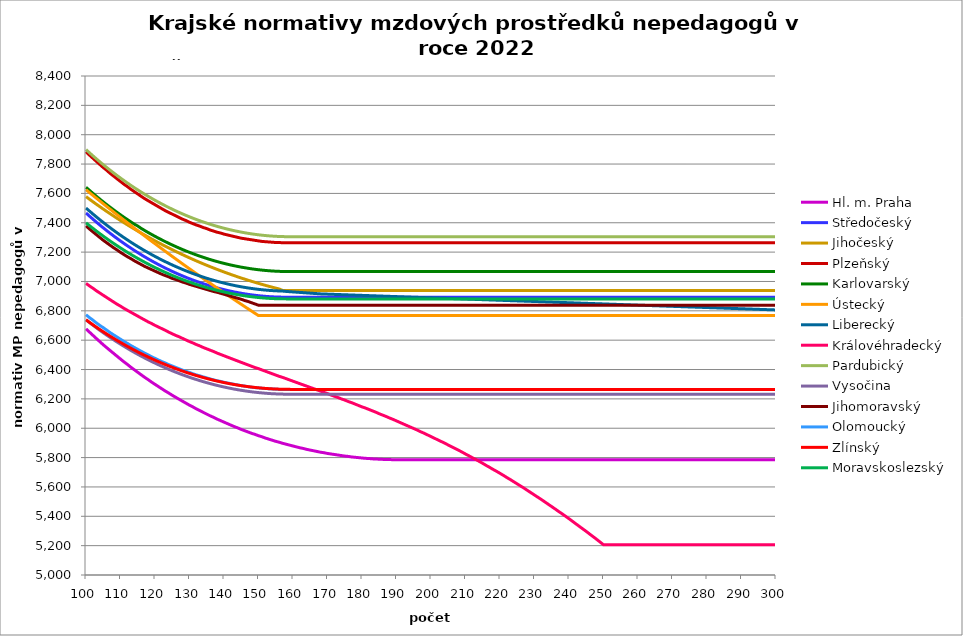
| Category | Hl. m. Praha | Středočeský | Jihočeský | Plzeňský | Karlovarský  | Ústecký   | Liberecký | Královéhradecký | Pardubický | Vysočina | Jihomoravský | Olomoucký | Zlínský | Moravskoslezský |
|---|---|---|---|---|---|---|---|---|---|---|---|---|---|---|
| 100.0 | 6676.923 | 7466.548 | 7577.911 | 7884.544 | 7641.729 | 7625.239 | 7500.268 | 6987.106 | 7898.649 | 6738.166 | 7379 | 6773.107 | 6738.973 | 7399.633 |
| 101.0 | 6655.006 | 7445.368 | 7560.495 | 7860.931 | 7620.936 | 7605.957 | 7479.754 | 6969.691 | 7877.157 | 6719.787 | 7357.595 | 6753.969 | 6721.897 | 7380.663 |
| 102.0 | 6633.232 | 7424.673 | 7543.346 | 7839.587 | 7600.608 | 7586.771 | 7459.699 | 6954.091 | 7856.145 | 6701.976 | 7338.243 | 6736.664 | 6705.197 | 7362.117 |
| 103.0 | 6611.6 | 7404.456 | 7526.462 | 7818.359 | 7580.738 | 7567.682 | 7440.097 | 6936.839 | 7835.607 | 6684.414 | 7318.993 | 6717.731 | 6688.867 | 7343.989 |
| 104.0 | 6590.109 | 7384.71 | 7509.839 | 7797.245 | 7561.32 | 7548.689 | 7420.941 | 6921.386 | 7815.537 | 6667.253 | 7299.843 | 6700.612 | 6672.904 | 7326.274 |
| 105.0 | 6568.757 | 7365.428 | 7493.475 | 7776.246 | 7542.349 | 7529.791 | 7402.226 | 6906.001 | 7795.928 | 6650.639 | 7280.793 | 6685.278 | 6657.301 | 7308.966 |
| 106.0 | 6549.054 | 7346.605 | 7477.365 | 7757.442 | 7523.818 | 7510.988 | 7383.946 | 6890.685 | 7776.774 | 6634.261 | 7263.733 | 6668.324 | 6642.056 | 7292.06 |
| 107.0 | 6529.469 | 7328.233 | 7461.509 | 7736.656 | 7505.721 | 7492.278 | 7366.095 | 6875.436 | 7758.068 | 6618.267 | 7246.753 | 6651.455 | 6627.163 | 7275.551 |
| 108.0 | 6510 | 7310.307 | 7445.902 | 7718.043 | 7488.053 | 7473.661 | 7348.667 | 6860.255 | 7739.806 | 6602.652 | 7229.852 | 6636.345 | 6612.618 | 7259.435 |
| 109.0 | 6490.647 | 7292.821 | 7430.543 | 7699.52 | 7470.808 | 7455.136 | 7331.657 | 6845.141 | 7721.981 | 6587.413 | 7214.895 | 6621.304 | 6598.417 | 7243.706 |
| 110.0 | 6471.409 | 7275.769 | 7415.428 | 7681.085 | 7453.981 | 7436.703 | 7315.06 | 6831.762 | 7704.589 | 6572.692 | 7198.142 | 6606.332 | 6584.556 | 7228.36 |
| 111.0 | 6452.285 | 7259.146 | 7400.555 | 7662.739 | 7437.567 | 7418.361 | 7298.87 | 6816.772 | 7687.623 | 6558.187 | 7183.316 | 6591.426 | 6571.031 | 7213.392 |
| 112.0 | 6434.731 | 7242.946 | 7385.921 | 7646.504 | 7421.561 | 7400.109 | 7283.083 | 6803.504 | 7671.079 | 6544.043 | 7168.551 | 6578.234 | 6557.838 | 7198.799 |
| 113.0 | 6415.823 | 7227.165 | 7371.524 | 7628.322 | 7405.958 | 7381.947 | 7267.694 | 6790.287 | 7654.951 | 6530.255 | 7155.681 | 6563.455 | 6544.974 | 7184.576 |
| 114.0 | 6398.467 | 7211.796 | 7357.362 | 7612.233 | 7390.754 | 7363.874 | 7252.699 | 6777.121 | 7639.236 | 6516.968 | 7141.029 | 6550.374 | 6532.436 | 7170.719 |
| 115.0 | 6381.205 | 7196.837 | 7343.432 | 7596.212 | 7377.787 | 7345.889 | 7238.092 | 6764.006 | 7623.927 | 6503.734 | 7128.258 | 6537.345 | 6520.218 | 7157.224 |
| 116.0 | 6364.036 | 7182.28 | 7329.731 | 7580.257 | 7361.523 | 7327.991 | 7223.87 | 6750.942 | 7609.022 | 6491.139 | 7115.532 | 6524.367 | 6508.319 | 7144.088 |
| 117.0 | 6346.959 | 7168.123 | 7316.258 | 7564.37 | 7347.487 | 7310.181 | 7210.028 | 6737.928 | 7594.515 | 6478.738 | 7102.851 | 6511.441 | 6496.735 | 7131.306 |
| 118.0 | 6331.385 | 7154.361 | 7303.011 | 7550.523 | 7333.834 | 7292.457 | 7196.563 | 6724.964 | 7580.402 | 6466.674 | 7092.018 | 6500.173 | 6485.463 | 7118.875 |
| 119.0 | 6314.483 | 7140.99 | 7289.986 | 7536.727 | 7320.557 | 7274.819 | 7183.47 | 6713.661 | 7566.679 | 6454.944 | 7081.218 | 6487.343 | 6474.5 | 7106.792 |
| 120.0 | 6299.068 | 7128.005 | 7277.182 | 7522.981 | 7307.654 | 7257.265 | 7170.746 | 6700.791 | 7553.342 | 6443.689 | 7070.451 | 6476.158 | 6463.843 | 7095.054 |
| 121.0 | 6283.728 | 7115.402 | 7264.597 | 7509.285 | 7295.121 | 7239.797 | 7158.386 | 6689.569 | 7540.388 | 6432.617 | 7059.717 | 6465.011 | 6453.489 | 7083.656 |
| 122.0 | 6268.463 | 7103.179 | 7252.229 | 7495.639 | 7282.955 | 7222.412 | 7146.389 | 6678.385 | 7527.812 | 6421.869 | 7049.015 | 6453.903 | 6443.436 | 7072.597 |
| 123.0 | 6253.272 | 7091.33 | 7240.076 | 7482.042 | 7271.151 | 7205.11 | 7134.749 | 6667.239 | 7515.612 | 6411.442 | 7040.121 | 6444.412 | 6433.68 | 7061.873 |
| 124.0 | 6239.525 | 7079.853 | 7228.136 | 7470.427 | 7259.707 | 7187.892 | 7123.464 | 6654.545 | 7503.783 | 6401.332 | 7031.25 | 6433.374 | 6424.219 | 7051.481 |
| 125.0 | 6224.474 | 7068.744 | 7216.406 | 7458.848 | 7248.619 | 7170.755 | 7112.53 | 6643.478 | 7492.322 | 6391.539 | 7020.634 | 6423.943 | 6415.051 | 7041.418 |
| 126.0 | 6210.853 | 7058.001 | 7204.886 | 7447.305 | 7237.884 | 7153.7 | 7101.945 | 6632.448 | 7481.227 | 6382.199 | 7013.575 | 6414.54 | 6406.173 | 7031.682 |
| 127.0 | 6197.293 | 7047.618 | 7193.573 | 7435.797 | 7227.5 | 7136.726 | 7091.706 | 6623.022 | 7470.493 | 6372.886 | 7004.77 | 6405.164 | 6397.584 | 7022.271 |
| 128.0 | 6183.791 | 7037.595 | 7182.466 | 7424.325 | 7217.463 | 7119.832 | 7081.809 | 6612.06 | 7460.119 | 6364.022 | 6995.988 | 6395.816 | 6389.28 | 7013.181 |
| 129.0 | 6170.348 | 7027.927 | 7171.562 | 7414.792 | 7207.77 | 7103.018 | 7072.252 | 6601.133 | 7450.1 | 6355.603 | 6988.978 | 6388.047 | 6381.26 | 7004.41 |
| 130.0 | 6156.963 | 7018.612 | 7160.861 | 7403.385 | 7198.42 | 7086.283 | 7063.033 | 6590.243 | 7440.435 | 6347.345 | 6980.235 | 6380.296 | 6373.521 | 6995.956 |
| 131.0 | 6144.966 | 7009.647 | 7150.36 | 7393.905 | 7189.409 | 7069.627 | 7054.148 | 6580.937 | 7431.121 | 6339.389 | 6973.257 | 6371.02 | 6366.062 | 6987.817 |
| 132.0 | 6131.692 | 7001.03 | 7140.057 | 7384.45 | 7180.735 | 7053.048 | 7045.595 | 6570.113 | 7422.156 | 6331.73 | 6966.292 | 6363.311 | 6358.881 | 6979.991 |
| 133.0 | 6119.793 | 6992.758 | 7129.952 | 7376.903 | 7172.395 | 7036.548 | 7037.372 | 6560.863 | 7413.536 | 6324.228 | 6959.341 | 6357.157 | 6351.976 | 6972.475 |
| 134.0 | 6107.941 | 6984.829 | 7120.043 | 7367.492 | 7164.388 | 7020.124 | 7029.478 | 6550.105 | 7405.259 | 6317.16 | 6952.405 | 6349.481 | 6345.345 | 6965.268 |
| 135.0 | 6096.134 | 6977.241 | 7110.328 | 7359.98 | 7156.711 | 7003.777 | 7021.908 | 6540.912 | 7397.324 | 6310.521 | 6945.482 | 6343.353 | 6338.986 | 6958.367 |
| 136.0 | 6084.373 | 6969.99 | 7100.805 | 7350.611 | 7149.362 | 6987.506 | 7014.663 | 6531.745 | 7389.728 | 6304.035 | 6938.572 | 6335.711 | 6332.898 | 6951.771 |
| 137.0 | 6073.957 | 6963.076 | 7091.474 | 7343.133 | 7142.339 | 6971.311 | 7007.739 | 6522.603 | 7382.469 | 6297.837 | 6931.677 | 6329.61 | 6327.08 | 6945.479 |
| 138.0 | 6062.281 | 6956.497 | 7082.332 | 7335.671 | 7135.64 | 6955.19 | 7001.134 | 6511.97 | 7375.545 | 6291.926 | 6926.514 | 6323.521 | 6321.53 | 6939.489 |
| 139.0 | 6051.94 | 6950.25 | 7073.379 | 7330.084 | 7129.264 | 6939.144 | 6994.848 | 6502.884 | 7368.954 | 6286.3 | 6919.643 | 6318.962 | 6316.246 | 6933.798 |
| 140.0 | 6041.635 | 6944.333 | 7064.614 | 7322.648 | 7123.208 | 6923.171 | 6988.878 | 6493.823 | 7362.695 | 6281.095 | 6912.785 | 6312.893 | 6311.227 | 6928.406 |
| 141.0 | 6031.364 | 6938.746 | 7056.034 | 7317.081 | 7117.472 | 6907.272 | 6983.222 | 6484.787 | 7356.766 | 6275.898 | 6905.941 | 6308.349 | 6306.473 | 6923.312 |
| 142.0 | 6021.129 | 6933.486 | 7047.638 | 7311.522 | 7112.053 | 6891.446 | 6977.88 | 6475.776 | 7351.165 | 6271.119 | 6899.11 | 6303.812 | 6301.981 | 6918.514 |
| 143.0 | 6010.928 | 6928.552 | 7039.426 | 7305.972 | 7106.951 | 6875.692 | 6972.85 | 6466.79 | 7345.891 | 6266.62 | 6892.292 | 6299.281 | 6297.751 | 6914.01 |
| 144.0 | 6002.03 | 6923.943 | 7031.396 | 7300.43 | 7102.163 | 6860.01 | 6968.13 | 6457.829 | 7340.943 | 6262.4 | 6885.489 | 6294.757 | 6293.782 | 6909.8 |
| 145.0 | 5991.894 | 6919.657 | 7023.547 | 7294.896 | 7097.689 | 6844.399 | 6963.719 | 6448.893 | 7336.318 | 6258.457 | 6878.698 | 6290.239 | 6290.072 | 6905.883 |
| 146.0 | 5983.052 | 6915.694 | 7015.877 | 7291.212 | 7093.528 | 6828.86 | 6959.616 | 6439.982 | 7332.017 | 6254.79 | 6870.229 | 6287.231 | 6286.621 | 6902.257 |
| 147.0 | 5974.237 | 6912.051 | 7008.387 | 7287.532 | 7089.678 | 6813.39 | 6955.821 | 6431.095 | 7328.037 | 6251.399 | 6863.469 | 6282.724 | 6283.428 | 6898.922 |
| 148.0 | 5965.448 | 6908.729 | 7001.073 | 7283.855 | 7086.138 | 6797.991 | 6952.331 | 6422.232 | 7324.379 | 6248.147 | 6855.037 | 6279.723 | 6280.493 | 6895.877 |
| 149.0 | 5957.935 | 6905.726 | 6993.937 | 7280.182 | 7082.907 | 6782.661 | 6949.146 | 6413.394 | 7321.039 | 6245.439 | 6846.626 | 6276.725 | 6277.813 | 6893.121 |
| 150.0 | 5949.193 | 6903.041 | 6986.976 | 7276.512 | 7079.986 | 6767.4 | 6946.266 | 6406.048 | 7318.019 | 6242.869 | 6838.235 | 6275.227 | 6275.39 | 6890.654 |
| 151.0 | 5941.721 | 6900.674 | 6980.189 | 7272.846 | 7077.372 | 6767.4 | 6943.689 | 6397.255 | 7315.318 | 6240.707 | 6838.235 | 6272.233 | 6273.222 | 6888.474 |
| 152.0 | 5933.027 | 6898.623 | 6973.575 | 7271.015 | 7075.065 | 6767.4 | 6941.414 | 6388.485 | 7312.933 | 6238.546 | 6838.235 | 6270.737 | 6271.308 | 6886.581 |
| 153.0 | 5925.595 | 6896.889 | 6967.135 | 7269.184 | 7073.064 | 6767.4 | 6939.442 | 6379.74 | 7310.865 | 6236.656 | 6838.235 | 6269.242 | 6269.649 | 6884.976 |
| 154.0 | 5918.182 | 6895.471 | 6960.866 | 7267.355 | 7071.37 | 6767.4 | 6937.772 | 6371.018 | 7309.114 | 6235.172 | 6838.235 | 6267.747 | 6268.243 | 6883.656 |
| 155.0 | 5910.787 | 6894.369 | 6954.767 | 7265.526 | 7069.981 | 6767.4 | 6936.403 | 6362.321 | 7307.679 | 6234.093 | 6838.235 | 6266.254 | 6267.091 | 6882.623 |
| 156.0 | 5904.639 | 6893.582 | 6948.839 | 7265.526 | 7068.898 | 6767.4 | 6935.335 | 6353.647 | 7306.559 | 6233.15 | 6838.235 | 6264.761 | 6266.192 | 6881.876 |
| 157.0 | 5897.278 | 6893.109 | 6938.592 | 7263.698 | 7068.119 | 6767.4 | 6934.567 | 6346.437 | 7305.754 | 6232.476 | 6838.235 | 6264.761 | 6265.546 | 6881.414 |
| 158.0 | 5891.158 | 6892.952 | 6938.592 | 7263.698 | 7067.645 | 6767.4 | 6932.066 | 6337.806 | 7305.264 | 6231.937 | 6838.235 | 6263.268 | 6265.153 | 6881.406 |
| 159.0 | 5885.051 | 6893.109 | 6938.592 | 7263.698 | 7067.476 | 6767.4 | 6930.399 | 6329.199 | 7305.089 | 6231.802 | 6838.235 | 6263.268 | 6265.013 | 6881.406 |
| 160.0 | 5878.956 | 6892.952 | 6938.592 | 7263.698 | 7067.612 | 6767.4 | 6928.733 | 6320.615 | 7304.88 | 6231.667 | 6838.235 | 6263.268 | 6263.441 | 6881.406 |
| 161.0 | 5872.874 | 6892.952 | 6938.592 | 7263.698 | 7067.273 | 6767.4 | 6927.068 | 6312.054 | 7304.88 | 6231.667 | 6838.235 | 6263.268 | 6263.441 | 6881.406 |
| 162.0 | 5866.804 | 6892.952 | 6938.592 | 7263.698 | 7067.273 | 6767.4 | 6925.404 | 6303.517 | 7304.88 | 6231.667 | 6838.235 | 6263.268 | 6263.441 | 6881.406 |
| 163.0 | 5861.958 | 6892.952 | 6938.592 | 7263.698 | 7067.273 | 6767.4 | 6923.74 | 6295.002 | 7304.88 | 6231.667 | 6838.235 | 6263.268 | 6263.441 | 6881.406 |
| 164.0 | 5855.911 | 6892.952 | 6938.592 | 7263.698 | 7067.273 | 6767.4 | 6922.077 | 6286.511 | 7304.88 | 6231.667 | 6838.235 | 6263.268 | 6263.441 | 6881.406 |
| 165.0 | 5851.082 | 6892.952 | 6938.592 | 7263.698 | 7067.273 | 6767.4 | 6920.415 | 6278.042 | 7304.88 | 6231.667 | 6838.235 | 6263.268 | 6263.441 | 6881.406 |
| 166.0 | 5846.262 | 6892.952 | 6938.592 | 7263.698 | 7067.273 | 6767.4 | 6918.754 | 6269.596 | 7304.88 | 6231.667 | 6838.235 | 6263.268 | 6263.441 | 6881.406 |
| 167.0 | 5841.449 | 6892.952 | 6938.592 | 7263.698 | 7067.273 | 6767.4 | 6917.094 | 6261.173 | 7304.88 | 6231.667 | 6838.235 | 6263.268 | 6263.441 | 6881.406 |
| 168.0 | 5836.644 | 6892.952 | 6938.592 | 7263.698 | 7067.273 | 6767.4 | 6915.434 | 6252.773 | 7304.88 | 6231.667 | 6838.235 | 6263.268 | 6263.441 | 6881.406 |
| 169.0 | 5833.046 | 6892.952 | 6938.592 | 7263.698 | 7067.273 | 6767.4 | 6914.458 | 6244.395 | 7304.88 | 6231.667 | 6838.235 | 6263.268 | 6263.441 | 6881.406 |
| 170.0 | 5828.255 | 6892.952 | 6938.592 | 7263.698 | 7067.273 | 6767.4 | 6913.775 | 6236.039 | 7304.88 | 6231.667 | 6838.235 | 6263.268 | 6263.441 | 6881.406 |
| 171.0 | 5824.667 | 6892.952 | 6938.592 | 7263.698 | 7067.273 | 6767.4 | 6912.875 | 6226.319 | 7304.88 | 6231.667 | 6838.235 | 6263.268 | 6263.441 | 6881.406 |
| 172.0 | 5821.083 | 6892.952 | 6938.592 | 7263.698 | 7067.273 | 6767.4 | 6912.033 | 6218.012 | 7304.88 | 6231.667 | 6838.235 | 6263.268 | 6263.441 | 6881.406 |
| 173.0 | 5817.504 | 6892.952 | 6938.592 | 7263.698 | 7067.273 | 6767.4 | 6911.192 | 6209.727 | 7304.88 | 6231.667 | 6838.235 | 6263.268 | 6263.441 | 6881.406 |
| 174.0 | 5813.929 | 6892.952 | 6938.592 | 7263.698 | 7067.273 | 6767.4 | 6910.351 | 6200.089 | 7304.88 | 6231.667 | 6838.235 | 6263.268 | 6263.441 | 6881.406 |
| 175.0 | 5810.358 | 6892.952 | 6938.592 | 7263.698 | 7067.273 | 6767.4 | 6909.51 | 6191.851 | 7304.88 | 6231.667 | 6838.235 | 6263.268 | 6263.441 | 6881.406 |
| 176.0 | 5807.98 | 6892.952 | 6938.592 | 7263.698 | 7067.273 | 6767.4 | 6908.669 | 6182.268 | 7304.88 | 6231.667 | 6838.235 | 6263.268 | 6263.441 | 6881.406 |
| 177.0 | 5804.417 | 6892.952 | 6938.592 | 7263.698 | 7067.273 | 6767.4 | 6907.829 | 6174.078 | 7304.88 | 6231.667 | 6838.235 | 6263.268 | 6263.441 | 6881.406 |
| 178.0 | 5802.044 | 6892.952 | 6938.592 | 7263.698 | 7067.273 | 6767.4 | 6906.989 | 6164.55 | 7304.88 | 6231.667 | 6838.235 | 6263.268 | 6263.441 | 6881.406 |
| 179.0 | 5799.673 | 6892.952 | 6938.592 | 7263.698 | 7067.273 | 6767.4 | 6906.148 | 6155.052 | 7304.88 | 6231.667 | 6838.235 | 6263.268 | 6263.441 | 6881.406 |
| 180.0 | 5797.304 | 6892.952 | 6938.592 | 7263.698 | 7067.273 | 6767.4 | 6905.309 | 6145.582 | 7304.88 | 6231.667 | 6838.235 | 6263.268 | 6263.441 | 6881.406 |
| 181.0 | 5794.937 | 6892.952 | 6938.592 | 7263.698 | 7067.273 | 6767.4 | 6904.469 | 6137.489 | 7304.88 | 6231.667 | 6838.235 | 6263.268 | 6263.441 | 6881.406 |
| 182.0 | 5793.754 | 6892.952 | 6938.592 | 7263.698 | 7067.273 | 6767.4 | 6903.63 | 6128.074 | 7304.88 | 6231.667 | 6838.235 | 6263.268 | 6263.441 | 6881.406 |
| 183.0 | 5791.39 | 6892.952 | 6938.592 | 7263.698 | 7067.273 | 6767.4 | 6902.79 | 6118.687 | 7304.88 | 6231.667 | 6838.235 | 6263.268 | 6263.441 | 6881.406 |
| 184.0 | 5790.208 | 6892.952 | 6938.592 | 7263.698 | 7067.273 | 6767.4 | 6901.951 | 6109.329 | 7304.88 | 6231.667 | 6838.235 | 6263.268 | 6263.441 | 6881.406 |
| 185.0 | 5789.027 | 6892.952 | 6938.592 | 7263.698 | 7067.273 | 6767.4 | 6901.112 | 6098.67 | 7304.88 | 6231.667 | 6838.235 | 6263.268 | 6263.441 | 6881.406 |
| 186.0 | 5787.847 | 6892.952 | 6938.592 | 7263.698 | 7067.273 | 6767.4 | 6900.274 | 6089.373 | 7304.88 | 6231.667 | 6838.235 | 6263.268 | 6263.441 | 6881.406 |
| 187.0 | 5786.667 | 6892.952 | 6938.592 | 7263.698 | 7067.273 | 6767.4 | 6899.435 | 6080.104 | 7304.88 | 6231.667 | 6838.235 | 6263.268 | 6263.441 | 6881.406 |
| 188.0 | 5786.667 | 6892.952 | 6938.592 | 7263.698 | 7067.273 | 6767.4 | 6898.597 | 6069.546 | 7304.88 | 6231.667 | 6838.235 | 6263.268 | 6263.441 | 6881.406 |
| 189.0 | 5785.487 | 6892.952 | 6938.592 | 7263.698 | 7067.273 | 6767.4 | 6897.759 | 6060.338 | 7304.88 | 6231.667 | 6838.235 | 6263.268 | 6263.441 | 6881.406 |
| 190.0 | 5785.487 | 6892.952 | 6938.592 | 7263.698 | 7067.273 | 6767.4 | 6896.921 | 6049.849 | 7304.88 | 6231.667 | 6838.235 | 6263.268 | 6263.441 | 6881.406 |
| 191.0 | 5785.487 | 6892.952 | 6938.592 | 7263.698 | 7067.273 | 6767.4 | 6896.084 | 6039.395 | 7304.88 | 6231.667 | 6838.235 | 6263.268 | 6263.441 | 6881.406 |
| 192.0 | 5785.487 | 6892.952 | 6938.592 | 7263.698 | 7067.273 | 6767.4 | 6895.246 | 6028.978 | 7304.88 | 6231.667 | 6838.235 | 6263.268 | 6263.441 | 6881.406 |
| 193.0 | 5785.487 | 6892.952 | 6938.592 | 7263.698 | 7067.273 | 6767.4 | 6894.409 | 6018.597 | 7304.88 | 6231.667 | 6838.235 | 6263.268 | 6263.441 | 6881.406 |
| 194.0 | 5785.487 | 6892.952 | 6938.592 | 7263.698 | 7067.273 | 6767.4 | 6893.572 | 6008.251 | 7304.88 | 6231.667 | 6838.235 | 6263.268 | 6263.441 | 6881.406 |
| 195.0 | 5785.487 | 6892.952 | 6938.592 | 7263.698 | 7067.273 | 6767.4 | 6892.735 | 5997.941 | 7304.88 | 6231.667 | 6838.235 | 6263.268 | 6263.441 | 6881.406 |
| 196.0 | 5785.487 | 6892.952 | 6938.592 | 7263.698 | 7067.273 | 6767.4 | 6891.899 | 5987.666 | 7304.88 | 6231.667 | 6838.235 | 6263.268 | 6263.441 | 6881.406 |
| 197.0 | 5785.487 | 6892.952 | 6938.592 | 7263.698 | 7067.273 | 6767.4 | 6891.062 | 5976.149 | 7304.88 | 6231.667 | 6838.235 | 6263.268 | 6263.441 | 6881.406 |
| 198.0 | 5785.487 | 6892.952 | 6938.592 | 7263.698 | 7067.273 | 6767.4 | 6890.226 | 5965.948 | 7304.88 | 6231.667 | 6838.235 | 6263.268 | 6263.441 | 6881.406 |
| 199.0 | 5785.487 | 6892.952 | 6938.592 | 7263.698 | 7067.273 | 6767.4 | 6889.39 | 5954.514 | 7304.88 | 6231.667 | 6838.235 | 6263.268 | 6263.441 | 6881.406 |
| 200.0 | 5785.487 | 6892.952 | 6938.592 | 7263.698 | 7067.273 | 6767.4 | 6888.554 | 5943.124 | 7304.88 | 6231.667 | 6838.235 | 6263.268 | 6263.441 | 6881.406 |
| 201.0 | 5785.487 | 6892.952 | 6938.592 | 7263.698 | 7067.273 | 6767.4 | 6887.719 | 5931.778 | 7304.88 | 6231.667 | 6838.235 | 6263.268 | 6263.441 | 6881.406 |
| 202.0 | 5785.487 | 6892.952 | 6938.592 | 7263.698 | 7067.273 | 6767.4 | 6886.883 | 5920.474 | 7304.88 | 6231.667 | 6838.235 | 6263.268 | 6263.441 | 6881.406 |
| 203.0 | 5785.487 | 6892.952 | 6938.592 | 7263.698 | 7067.273 | 6767.4 | 6886.048 | 5909.214 | 7304.88 | 6231.667 | 6838.235 | 6263.268 | 6263.441 | 6881.406 |
| 204.0 | 5785.487 | 6892.952 | 6938.592 | 7263.698 | 7067.273 | 6767.4 | 6885.213 | 5897.996 | 7304.88 | 6231.667 | 6838.235 | 6263.268 | 6263.441 | 6881.406 |
| 205.0 | 5785.487 | 6892.952 | 6938.592 | 7263.698 | 7067.273 | 6767.4 | 6884.378 | 5885.582 | 7304.88 | 6231.667 | 6838.235 | 6263.268 | 6263.441 | 6881.406 |
| 206.0 | 5785.487 | 6892.952 | 6938.592 | 7263.698 | 7067.273 | 6767.4 | 6883.544 | 5873.22 | 7304.88 | 6231.667 | 6838.235 | 6263.268 | 6263.441 | 6881.406 |
| 207.0 | 5785.487 | 6892.952 | 6938.592 | 7263.698 | 7067.273 | 6767.4 | 6882.709 | 5862.138 | 7304.88 | 6231.667 | 6838.235 | 6263.268 | 6263.441 | 6881.406 |
| 208.0 | 5785.487 | 6892.952 | 6938.592 | 7263.698 | 7067.273 | 6767.4 | 6881.875 | 5849.874 | 7304.88 | 6231.667 | 6838.235 | 6263.268 | 6263.441 | 6881.406 |
| 209.0 | 5785.487 | 6892.952 | 6938.592 | 7263.698 | 7067.273 | 6767.4 | 6881.041 | 5837.662 | 7304.88 | 6231.667 | 6838.235 | 6263.268 | 6263.441 | 6881.406 |
| 210.0 | 5785.487 | 6892.952 | 6938.592 | 7263.698 | 7067.273 | 6767.4 | 6880.208 | 5824.287 | 7304.88 | 6231.667 | 6838.235 | 6263.268 | 6263.441 | 6881.406 |
| 211.0 | 5785.487 | 6892.952 | 6938.592 | 7263.698 | 7067.273 | 6767.4 | 6879.374 | 5812.18 | 7304.88 | 6231.667 | 6838.235 | 6263.268 | 6263.441 | 6881.406 |
| 212.0 | 5785.487 | 6892.952 | 6938.592 | 7263.698 | 7067.273 | 6767.4 | 6878.541 | 5798.922 | 7304.88 | 6231.667 | 6838.235 | 6263.268 | 6263.441 | 6881.406 |
| 213.0 | 5785.487 | 6892.952 | 6938.592 | 7263.698 | 7067.273 | 6767.4 | 6877.707 | 5786.921 | 7304.88 | 6231.667 | 6838.235 | 6263.268 | 6263.441 | 6881.406 |
| 214.0 | 5785.487 | 6892.952 | 6938.592 | 7263.698 | 7067.273 | 6767.4 | 6876.875 | 5773.777 | 7304.88 | 6231.667 | 6838.235 | 6263.268 | 6263.441 | 6881.406 |
| 215.0 | 5785.487 | 6892.952 | 6938.592 | 7263.698 | 7067.273 | 6767.4 | 6876.042 | 5760.692 | 7304.88 | 6231.667 | 6838.235 | 6263.268 | 6263.441 | 6881.406 |
| 216.0 | 5785.487 | 6892.952 | 6938.592 | 7263.698 | 7067.273 | 6767.4 | 6875.209 | 5746.486 | 7304.88 | 6231.667 | 6838.235 | 6263.268 | 6263.441 | 6881.406 |
| 217.0 | 5785.487 | 6892.952 | 6938.592 | 7263.698 | 7067.273 | 6767.4 | 6874.377 | 5733.525 | 7304.88 | 6231.667 | 6838.235 | 6263.268 | 6263.441 | 6881.406 |
| 218.0 | 5785.487 | 6892.952 | 6938.592 | 7263.698 | 7067.273 | 6767.4 | 6873.545 | 5719.452 | 7304.88 | 6231.667 | 6838.235 | 6263.268 | 6263.441 | 6881.406 |
| 219.0 | 5785.487 | 6892.952 | 6938.592 | 7263.698 | 7067.273 | 6767.4 | 6872.713 | 5706.612 | 7304.88 | 6231.667 | 6838.235 | 6263.268 | 6263.441 | 6881.406 |
| 220.0 | 5785.487 | 6892.952 | 6938.592 | 7263.698 | 7067.273 | 6767.4 | 6871.881 | 5692.671 | 7304.88 | 6231.667 | 6838.235 | 6263.268 | 6263.441 | 6881.406 |
| 221.0 | 5785.487 | 6892.952 | 6938.592 | 7263.698 | 7067.273 | 6767.4 | 6871.049 | 5678.798 | 7304.88 | 6231.667 | 6838.235 | 6263.268 | 6263.441 | 6881.406 |
| 222.0 | 5785.487 | 6892.952 | 6938.592 | 7263.698 | 7067.273 | 6767.4 | 6870.218 | 5663.844 | 7304.88 | 6231.667 | 6838.235 | 6263.268 | 6263.441 | 6881.406 |
| 223.0 | 5785.487 | 6892.952 | 6938.592 | 7263.698 | 7067.273 | 6767.4 | 6869.387 | 5650.111 | 7304.88 | 6231.667 | 6838.235 | 6263.268 | 6263.441 | 6881.406 |
| 224.0 | 5785.487 | 6892.952 | 6938.592 | 7263.698 | 7067.273 | 6767.4 | 6868.556 | 5635.308 | 7304.88 | 6231.667 | 6838.235 | 6263.268 | 6263.441 | 6881.406 |
| 225.0 | 5785.487 | 6892.952 | 6938.592 | 7263.698 | 7067.273 | 6767.4 | 6867.725 | 5620.583 | 7304.88 | 6231.667 | 6838.235 | 6263.268 | 6263.441 | 6881.406 |
| 226.0 | 5785.487 | 6892.952 | 6938.592 | 7263.698 | 7067.273 | 6767.4 | 6866.895 | 5605.934 | 7304.88 | 6231.667 | 6838.235 | 6263.268 | 6263.441 | 6881.406 |
| 227.0 | 5785.487 | 6892.952 | 6938.592 | 7263.698 | 7067.273 | 6767.4 | 6866.064 | 5591.362 | 7304.88 | 6231.667 | 6838.235 | 6263.268 | 6263.441 | 6881.406 |
| 228.0 | 5785.487 | 6892.952 | 6938.592 | 7263.698 | 7067.273 | 6767.4 | 6865.234 | 5575.753 | 7304.88 | 6231.667 | 6838.235 | 6263.268 | 6263.441 | 6881.406 |
| 229.0 | 5785.487 | 6892.952 | 6938.592 | 7263.698 | 7067.273 | 6767.4 | 6864.404 | 5560.231 | 7304.88 | 6231.667 | 6838.235 | 6263.268 | 6263.441 | 6881.406 |
| 230.0 | 5785.487 | 6892.952 | 6938.592 | 7263.698 | 7067.273 | 6767.4 | 6863.575 | 5544.795 | 7304.88 | 6231.667 | 6838.235 | 6263.268 | 6263.441 | 6881.406 |
| 231.0 | 5785.487 | 6892.952 | 6938.592 | 7263.698 | 7067.273 | 6767.4 | 6862.745 | 5529.444 | 7304.88 | 6231.667 | 6838.235 | 6263.268 | 6263.441 | 6881.406 |
| 232.0 | 5785.487 | 6892.952 | 6938.592 | 7263.698 | 7067.273 | 6767.4 | 6861.916 | 5514.179 | 7304.88 | 6231.667 | 6838.235 | 6263.268 | 6263.441 | 6881.406 |
| 233.0 | 5785.487 | 6892.952 | 6938.592 | 7263.698 | 7067.273 | 6767.4 | 6861.087 | 5497.916 | 7304.88 | 6231.667 | 6838.235 | 6263.268 | 6263.441 | 6881.406 |
| 234.0 | 5785.487 | 6892.952 | 6938.592 | 7263.698 | 7067.273 | 6767.4 | 6860.258 | 5481.749 | 7304.88 | 6231.667 | 6838.235 | 6263.268 | 6263.441 | 6881.406 |
| 235.0 | 5785.487 | 6892.952 | 6938.592 | 7263.698 | 7067.273 | 6767.4 | 6859.429 | 5465.676 | 7304.88 | 6231.667 | 6838.235 | 6263.268 | 6263.441 | 6881.406 |
| 236.0 | 5785.487 | 6892.952 | 6938.592 | 7263.698 | 7067.273 | 6767.4 | 6858.6 | 5449.698 | 7304.88 | 6231.667 | 6838.235 | 6263.268 | 6263.441 | 6881.406 |
| 237.0 | 5785.487 | 6892.952 | 6938.592 | 7263.698 | 7067.273 | 6767.4 | 6857.772 | 5432.757 | 7304.88 | 6231.667 | 6838.235 | 6263.268 | 6263.441 | 6881.406 |
| 238.0 | 5785.487 | 6892.952 | 6938.592 | 7263.698 | 7067.273 | 6767.4 | 6856.944 | 5416.97 | 7304.88 | 6231.667 | 6838.235 | 6263.268 | 6263.441 | 6881.406 |
| 239.0 | 5785.487 | 6892.952 | 6938.592 | 7263.698 | 7067.273 | 6767.4 | 6856.116 | 5400.232 | 7304.88 | 6231.667 | 6838.235 | 6263.268 | 6263.441 | 6881.406 |
| 240.0 | 5785.487 | 6892.952 | 6938.592 | 7263.698 | 7067.273 | 6767.4 | 6855.288 | 5383.596 | 7304.88 | 6231.667 | 6838.235 | 6263.268 | 6263.441 | 6881.406 |
| 241.0 | 5785.487 | 6892.952 | 6938.592 | 7263.698 | 7067.273 | 6767.4 | 6854.461 | 5366.033 | 7304.88 | 6231.667 | 6838.235 | 6263.268 | 6263.441 | 6881.406 |
| 242.0 | 5785.487 | 6892.952 | 6938.592 | 7263.698 | 7067.273 | 6767.4 | 6853.633 | 5348.585 | 7304.88 | 6231.667 | 6838.235 | 6263.268 | 6263.441 | 6881.406 |
| 243.0 | 5785.487 | 6892.952 | 6938.592 | 7263.698 | 7067.273 | 6767.4 | 6852.806 | 5331.249 | 7304.88 | 6231.667 | 6838.235 | 6263.268 | 6263.441 | 6881.406 |
| 244.0 | 5785.487 | 6892.952 | 6938.592 | 7263.698 | 7067.273 | 6767.4 | 6851.979 | 5314.025 | 7304.88 | 6231.667 | 6838.235 | 6263.268 | 6263.441 | 6881.406 |
| 245.0 | 5785.487 | 6892.952 | 6938.592 | 7263.698 | 7067.273 | 6767.4 | 6851.153 | 5296.912 | 7304.88 | 6231.667 | 6838.235 | 6263.268 | 6263.441 | 6881.406 |
| 246.0 | 5785.487 | 6892.952 | 6938.592 | 7263.698 | 7067.273 | 6767.4 | 6850.326 | 5278.913 | 7304.88 | 6231.667 | 6838.235 | 6263.268 | 6263.441 | 6881.406 |
| 247.0 | 5785.487 | 6892.952 | 6938.592 | 7263.698 | 7067.273 | 6767.4 | 6849.5 | 5261.035 | 7304.88 | 6231.667 | 6838.235 | 6263.268 | 6263.441 | 6881.406 |
| 248.0 | 5785.487 | 6892.952 | 6938.592 | 7263.698 | 7067.273 | 6767.4 | 6848.674 | 5243.278 | 7304.88 | 6231.667 | 6838.235 | 6263.268 | 6263.441 | 6881.406 |
| 249.0 | 5785.487 | 6892.952 | 6938.592 | 7263.698 | 7067.273 | 6767.4 | 6847.848 | 5224.664 | 7304.88 | 6231.667 | 6838.235 | 6263.268 | 6263.441 | 6881.406 |
| 250.0 | 5785.487 | 6892.952 | 6938.592 | 7263.698 | 7067.273 | 6767.4 | 6847.022 | 5206.181 | 7304.88 | 6231.667 | 6838.235 | 6263.268 | 6263.441 | 6881.406 |
| 251.0 | 5785.487 | 6892.952 | 6938.592 | 7263.698 | 7067.273 | 6767.4 | 6846.196 | 5206.181 | 7304.88 | 6231.667 | 6838.235 | 6263.268 | 6263.441 | 6881.406 |
| 252.0 | 5785.487 | 6892.952 | 6938.592 | 7263.698 | 7067.273 | 6767.4 | 6845.371 | 5206.181 | 7304.88 | 6231.667 | 6838.235 | 6263.268 | 6263.441 | 6881.406 |
| 253.0 | 5785.487 | 6892.952 | 6938.592 | 7263.698 | 7067.273 | 6767.4 | 6844.546 | 5206.181 | 7304.88 | 6231.667 | 6838.235 | 6263.268 | 6263.441 | 6881.406 |
| 254.0 | 5785.487 | 6892.952 | 6938.592 | 7263.698 | 7067.273 | 6767.4 | 6843.721 | 5206.181 | 7304.88 | 6231.667 | 6838.235 | 6263.268 | 6263.441 | 6881.406 |
| 255.0 | 5785.487 | 6892.952 | 6938.592 | 7263.698 | 7067.273 | 6767.4 | 6842.896 | 5206.181 | 7304.88 | 6231.667 | 6838.235 | 6263.268 | 6263.441 | 6881.406 |
| 256.0 | 5785.487 | 6892.952 | 6938.592 | 7263.698 | 7067.273 | 6767.4 | 6842.072 | 5206.181 | 7304.88 | 6231.667 | 6838.235 | 6263.268 | 6263.441 | 6881.406 |
| 257.0 | 5785.487 | 6892.952 | 6938.592 | 7263.698 | 7067.273 | 6767.4 | 6841.247 | 5206.181 | 7304.88 | 6231.667 | 6838.235 | 6263.268 | 6263.441 | 6881.406 |
| 258.0 | 5785.487 | 6892.952 | 6938.592 | 7263.698 | 7067.273 | 6767.4 | 6840.423 | 5206.181 | 7304.88 | 6231.667 | 6838.235 | 6263.268 | 6263.441 | 6881.406 |
| 259.0 | 5785.487 | 6892.952 | 6938.592 | 7263.698 | 7067.273 | 6767.4 | 6839.599 | 5206.181 | 7304.88 | 6231.667 | 6838.235 | 6263.268 | 6263.441 | 6881.406 |
| 260.0 | 5785.487 | 6892.952 | 6938.592 | 7263.698 | 7067.273 | 6767.4 | 6838.775 | 5206.181 | 7304.88 | 6231.667 | 6838.235 | 6263.268 | 6263.441 | 6881.406 |
| 261.0 | 5785.487 | 6892.952 | 6938.592 | 7263.698 | 7067.273 | 6767.4 | 6837.952 | 5206.181 | 7304.88 | 6231.667 | 6838.235 | 6263.268 | 6263.441 | 6881.406 |
| 262.0 | 5785.487 | 6892.952 | 6938.592 | 7263.698 | 7067.273 | 6767.4 | 6837.129 | 5206.181 | 7304.88 | 6231.667 | 6838.235 | 6263.268 | 6263.441 | 6881.406 |
| 263.0 | 5785.487 | 6892.952 | 6938.592 | 7263.698 | 7067.273 | 6767.4 | 6836.305 | 5206.181 | 7304.88 | 6231.667 | 6838.235 | 6263.268 | 6263.441 | 6881.406 |
| 264.0 | 5785.487 | 6892.952 | 6938.592 | 7263.698 | 7067.273 | 6767.4 | 6835.482 | 5206.181 | 7304.88 | 6231.667 | 6838.235 | 6263.268 | 6263.441 | 6881.406 |
| 265.0 | 5785.487 | 6892.952 | 6938.592 | 7263.698 | 7067.273 | 6767.4 | 6834.66 | 5206.181 | 7304.88 | 6231.667 | 6838.235 | 6263.268 | 6263.441 | 6881.406 |
| 266.0 | 5785.487 | 6892.952 | 6938.592 | 7263.698 | 7067.273 | 6767.4 | 6833.837 | 5206.181 | 7304.88 | 6231.667 | 6838.235 | 6263.268 | 6263.441 | 6881.406 |
| 267.0 | 5785.487 | 6892.952 | 6938.592 | 7263.698 | 7067.273 | 6767.4 | 6833.015 | 5206.181 | 7304.88 | 6231.667 | 6838.235 | 6263.268 | 6263.441 | 6881.406 |
| 268.0 | 5785.487 | 6892.952 | 6938.592 | 7263.698 | 7067.273 | 6767.4 | 6832.193 | 5206.181 | 7304.88 | 6231.667 | 6838.235 | 6263.268 | 6263.441 | 6881.406 |
| 269.0 | 5785.487 | 6892.952 | 6938.592 | 7263.698 | 7067.273 | 6767.4 | 6831.371 | 5206.181 | 7304.88 | 6231.667 | 6838.235 | 6263.268 | 6263.441 | 6881.406 |
| 270.0 | 5785.487 | 6892.952 | 6938.592 | 7263.698 | 7067.273 | 6767.4 | 6830.549 | 5206.181 | 7304.88 | 6231.667 | 6838.235 | 6263.268 | 6263.441 | 6881.406 |
| 271.0 | 5785.487 | 6892.952 | 6938.592 | 7263.698 | 7067.273 | 6767.4 | 6829.727 | 5206.181 | 7304.88 | 6231.667 | 6838.235 | 6263.268 | 6263.441 | 6881.406 |
| 272.0 | 5785.487 | 6892.952 | 6938.592 | 7263.698 | 7067.273 | 6767.4 | 6828.906 | 5206.181 | 7304.88 | 6231.667 | 6838.235 | 6263.268 | 6263.441 | 6881.406 |
| 273.0 | 5785.487 | 6892.952 | 6938.592 | 7263.698 | 7067.273 | 6767.4 | 6828.085 | 5206.181 | 7304.88 | 6231.667 | 6838.235 | 6263.268 | 6263.441 | 6881.406 |
| 274.0 | 5785.487 | 6892.952 | 6938.592 | 7263.698 | 7067.273 | 6767.4 | 6827.264 | 5206.181 | 7304.88 | 6231.667 | 6838.235 | 6263.268 | 6263.441 | 6881.406 |
| 275.0 | 5785.487 | 6892.952 | 6938.592 | 7263.698 | 7067.273 | 6767.4 | 6826.443 | 5206.181 | 7304.88 | 6231.667 | 6838.235 | 6263.268 | 6263.441 | 6881.406 |
| 276.0 | 5785.487 | 6892.952 | 6938.592 | 7263.698 | 7067.273 | 6767.4 | 6825.622 | 5206.181 | 7304.88 | 6231.667 | 6838.235 | 6263.268 | 6263.441 | 6881.406 |
| 277.0 | 5785.487 | 6892.952 | 6938.592 | 7263.698 | 7067.273 | 6767.4 | 6824.802 | 5206.181 | 7304.88 | 6231.667 | 6838.235 | 6263.268 | 6263.441 | 6881.406 |
| 278.0 | 5785.487 | 6892.952 | 6938.592 | 7263.698 | 7067.273 | 6767.4 | 6823.982 | 5206.181 | 7304.88 | 6231.667 | 6838.235 | 6263.268 | 6263.441 | 6881.406 |
| 279.0 | 5785.487 | 6892.952 | 6938.592 | 7263.698 | 7067.273 | 6767.4 | 6823.162 | 5206.181 | 7304.88 | 6231.667 | 6838.235 | 6263.268 | 6263.441 | 6881.406 |
| 280.0 | 5785.487 | 6892.952 | 6938.592 | 7263.698 | 7067.273 | 6767.4 | 6822.342 | 5206.181 | 7304.88 | 6231.667 | 6838.235 | 6263.268 | 6263.441 | 6881.406 |
| 281.0 | 5785.487 | 6892.952 | 6938.592 | 7263.698 | 7067.273 | 6767.4 | 6821.522 | 5206.181 | 7304.88 | 6231.667 | 6838.235 | 6263.268 | 6263.441 | 6881.406 |
| 282.0 | 5785.487 | 6892.952 | 6938.592 | 7263.698 | 7067.273 | 6767.4 | 6820.703 | 5206.181 | 7304.88 | 6231.667 | 6838.235 | 6263.268 | 6263.441 | 6881.406 |
| 283.0 | 5785.487 | 6892.952 | 6938.592 | 7263.698 | 7067.273 | 6767.4 | 6819.884 | 5206.181 | 7304.88 | 6231.667 | 6838.235 | 6263.268 | 6263.441 | 6881.406 |
| 284.0 | 5785.487 | 6892.952 | 6938.592 | 7263.698 | 7067.273 | 6767.4 | 6819.065 | 5206.181 | 7304.88 | 6231.667 | 6838.235 | 6263.268 | 6263.441 | 6881.406 |
| 285.0 | 5785.487 | 6892.952 | 6938.592 | 7263.698 | 7067.273 | 6767.4 | 6818.246 | 5206.181 | 7304.88 | 6231.667 | 6838.235 | 6263.268 | 6263.441 | 6881.406 |
| 286.0 | 5785.487 | 6892.952 | 6938.592 | 7263.698 | 7067.273 | 6767.4 | 6817.427 | 5206.181 | 7304.88 | 6231.667 | 6838.235 | 6263.268 | 6263.441 | 6881.406 |
| 287.0 | 5785.487 | 6892.952 | 6938.592 | 7263.698 | 7067.273 | 6767.4 | 6816.609 | 5206.181 | 7304.88 | 6231.667 | 6838.235 | 6263.268 | 6263.441 | 6881.406 |
| 288.0 | 5785.487 | 6892.952 | 6938.592 | 7263.698 | 7067.273 | 6767.4 | 6815.791 | 5206.181 | 7304.88 | 6231.667 | 6838.235 | 6263.268 | 6263.441 | 6881.406 |
| 289.0 | 5785.487 | 6892.952 | 6938.592 | 7263.698 | 7067.273 | 6767.4 | 6814.973 | 5206.181 | 7304.88 | 6231.667 | 6838.235 | 6263.268 | 6263.441 | 6881.406 |
| 290.0 | 5785.487 | 6892.952 | 6938.592 | 7263.698 | 7067.273 | 6767.4 | 6814.155 | 5206.181 | 7304.88 | 6231.667 | 6838.235 | 6263.268 | 6263.441 | 6881.406 |
| 291.0 | 5785.487 | 6892.952 | 6938.592 | 7263.698 | 7067.273 | 6767.4 | 6813.337 | 5206.181 | 7304.88 | 6231.667 | 6838.235 | 6263.268 | 6263.441 | 6881.406 |
| 292.0 | 5785.487 | 6892.952 | 6938.592 | 7263.698 | 7067.273 | 6767.4 | 6812.52 | 5206.181 | 7304.88 | 6231.667 | 6838.235 | 6263.268 | 6263.441 | 6881.406 |
| 293.0 | 5785.487 | 6892.952 | 6938.592 | 7263.698 | 7067.273 | 6767.4 | 6811.703 | 5206.181 | 7304.88 | 6231.667 | 6838.235 | 6263.268 | 6263.441 | 6881.406 |
| 294.0 | 5785.487 | 6892.952 | 6938.592 | 7263.698 | 7067.273 | 6767.4 | 6810.886 | 5206.181 | 7304.88 | 6231.667 | 6838.235 | 6263.268 | 6263.441 | 6881.406 |
| 295.0 | 5785.487 | 6892.952 | 6938.592 | 7263.698 | 7067.273 | 6767.4 | 6810.069 | 5206.181 | 7304.88 | 6231.667 | 6838.235 | 6263.268 | 6263.441 | 6881.406 |
| 296.0 | 5785.487 | 6892.952 | 6938.592 | 7263.698 | 7067.273 | 6767.4 | 6809.252 | 5206.181 | 7304.88 | 6231.667 | 6838.235 | 6263.268 | 6263.441 | 6881.406 |
| 297.0 | 5785.487 | 6892.952 | 6938.592 | 7263.698 | 7067.273 | 6767.4 | 6808.436 | 5206.181 | 7304.88 | 6231.667 | 6838.235 | 6263.268 | 6263.441 | 6881.406 |
| 298.0 | 5785.487 | 6892.952 | 6938.592 | 7263.698 | 7067.273 | 6767.4 | 6807.619 | 5206.181 | 7304.88 | 6231.667 | 6838.235 | 6263.268 | 6263.441 | 6881.406 |
| 299.0 | 5785.487 | 6892.952 | 6938.592 | 7263.698 | 7067.273 | 6767.4 | 6806.803 | 5206.181 | 7304.88 | 6231.667 | 6838.235 | 6263.268 | 6263.441 | 6881.406 |
| 300.0 | 5785.487 | 6892.952 | 6938.592 | 7263.698 | 7067.273 | 6767.4 | 6805.987 | 5206.181 | 7304.88 | 6231.667 | 6838.235 | 6263.268 | 6263.441 | 6881.406 |